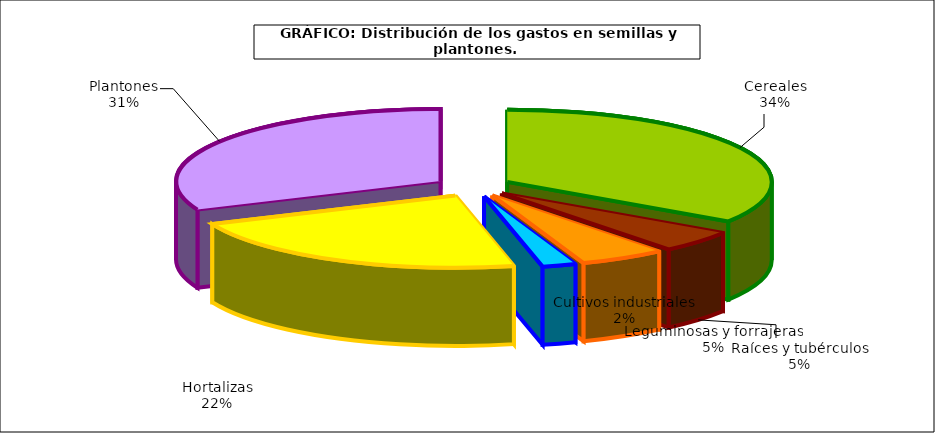
| Category | Series 0 |
|---|---|
| 0 | 364.955 |
| 1 | 52.093 |
| 2 | 55.999 |
| 3 | 21.954 |
| 4 | 235.508 |
| 5 | 335.234 |